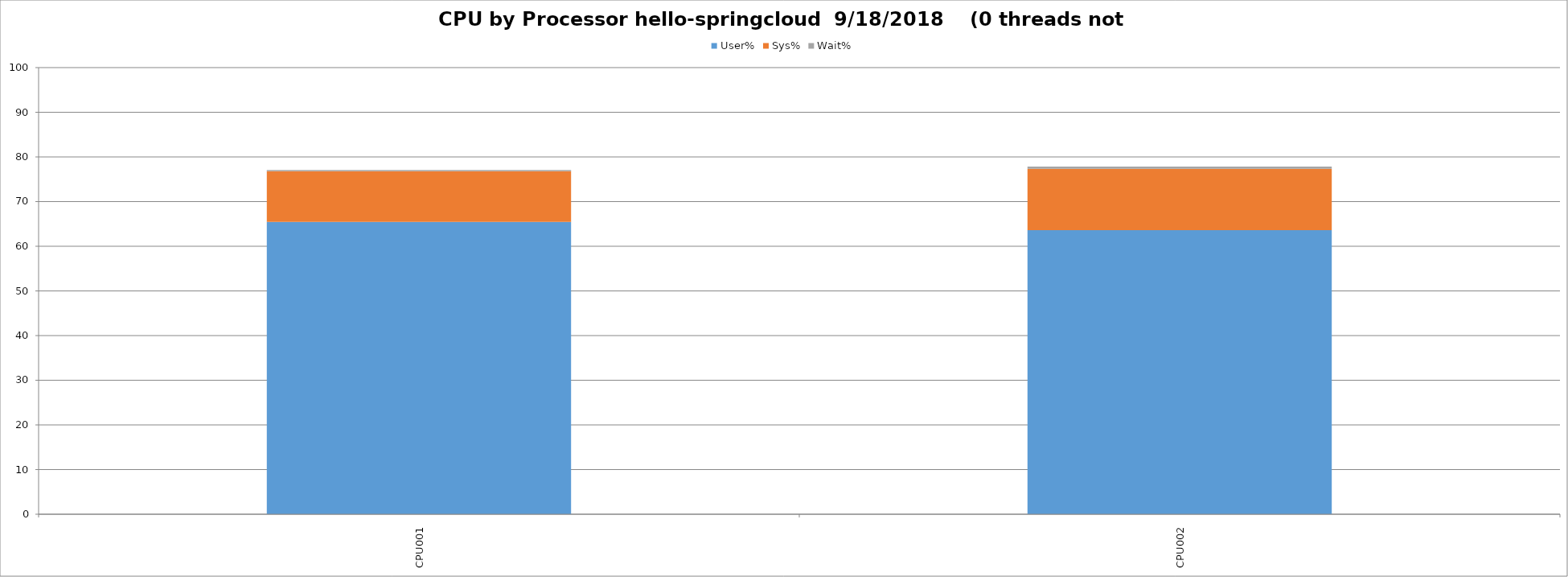
| Category | User% | Sys% | Wait% |
|---|---|---|---|
| CPU001 | 65.446 | 11.345 | 0.28 |
| CPU002 | 63.591 | 13.74 | 0.489 |